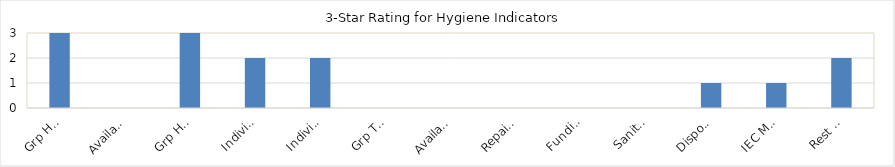
| Category | Series 0 |
|---|---|
| Grp Handwash Activity | 5 |
| Available Soap | 0 |
| Grp Handwash Facility | 5 |
| Individual Handwash Facility | 2 |
| Individual Handwash Practice | 2 |
| Grp Tooth brushing Activity | 0 |
| Available Toothbrush & paste | 0 |
| Repair & Main tenance | 0 |
| Funding of Supplies | 0 |
| Sanitary Pads | 0 |
| Disposal of Sanitary Pads | 1 |
| IEC Materials for MHM | 1 |
| Rest Space for MHM | 2 |